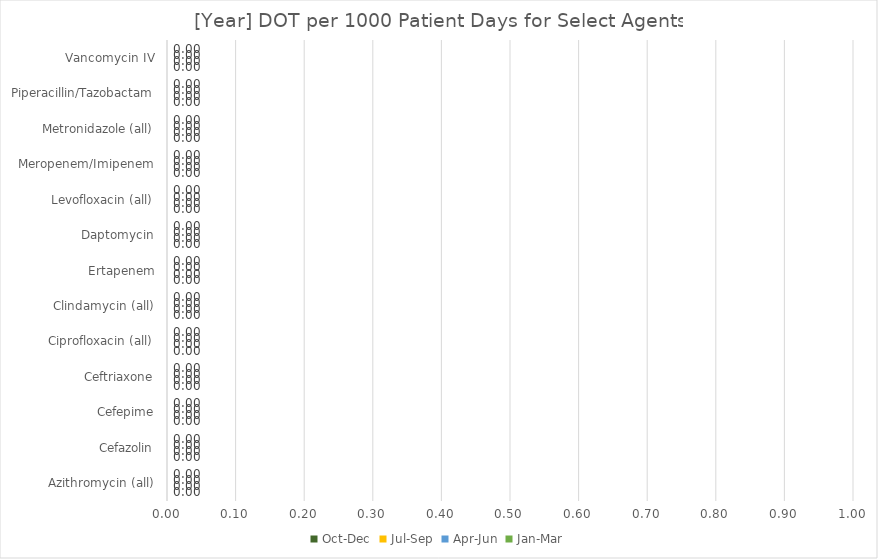
| Category | Oct-Dec | Jul-Sep | Apr-Jun | Jan-Mar |
|---|---|---|---|---|
| Azithromycin (all) | 0 | 0 | 0 | 0 |
| Cefazolin | 0 | 0 | 0 | 0 |
| Cefepime | 0 | 0 | 0 | 0 |
| Ceftriaxone | 0 | 0 | 0 | 0 |
| Ciprofloxacin (all) | 0 | 0 | 0 | 0 |
| Clindamycin (all) | 0 | 0 | 0 | 0 |
| Ertapenem | 0 | 0 | 0 | 0 |
| Daptomycin | 0 | 0 | 0 | 0 |
| Levofloxacin (all) | 0 | 0 | 0 | 0 |
| Meropenem/Imipenem | 0 | 0 | 0 | 0 |
| Metronidazole (all) | 0 | 0 | 0 | 0 |
| Piperacillin/Tazobactam | 0 | 0 | 0 | 0 |
| Vancomycin IV | 0 | 0 | 0 | 0 |